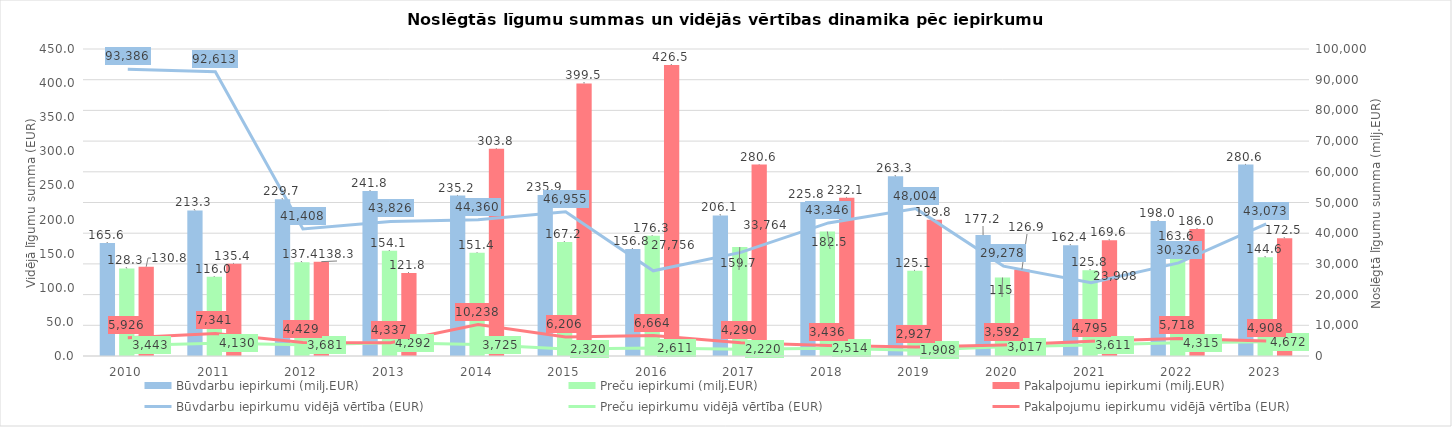
| Category | Būvdarbu iepirkumi (milj.EUR) | Preču iepirkumi (milj.EUR) | Pakalpojumu iepirkumi (milj.EUR) |
|---|---|---|---|
| 2010.0 | 165.6 | 128.3 | 130.8 |
| 2011.0 | 213.3 | 116 | 135.4 |
| 2012.0 | 229.7 | 137.4 | 138.3 |
| 2013.0 | 241.8 | 154.1 | 121.8 |
| 2014.0 | 235.2 | 151.4 | 303.8 |
| 2015.0 | 235.9 | 167.2 | 399.5 |
| 2016.0 | 156.8 | 176.3 | 426.5 |
| 2017.0 | 206.1 | 159.7 | 280.6 |
| 2018.0 | 225.8 | 182.5 | 232.1 |
| 2019.0 | 263.3 | 125.1 | 199.8 |
| 2020.0 | 177.2 | 115 | 126.9 |
| 2021.0 | 162.4 | 125.8 | 169.6 |
| 2022.0 | 198 | 163.6 | 186 |
| 2023.0 | 280.6 | 144.6 | 172.5 |